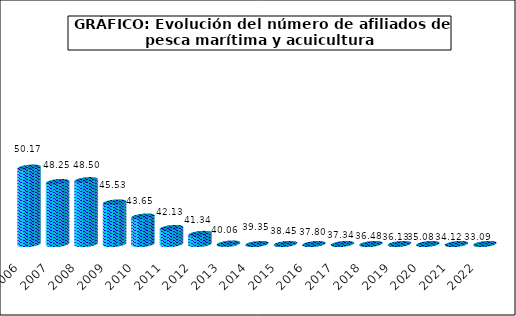
| Category | Series1 |
|---|---|
| 2006.0 | 50.17 |
| 2007.0 | 48.25 |
| 2008.0 | 48.5 |
| 2009.0 | 45.53 |
| 2010.0 | 43.65 |
| 2011.0 | 42.13 |
| 2012.0 | 41.34 |
| 2013.0 | 40.06 |
| 2014.0 | 39.35 |
| 2015.0 | 38.45 |
| 2016.0 | 37.8 |
| 2017.0 | 37.34 |
| 2018.0 | 36.48 |
| 2019.0 | 36.132 |
| 2020.0 | 35.084 |
| 2021.0 | 34.121 |
| 2022.0 | 33.09 |